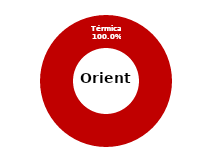
| Category | Oriente |
|---|---|
| Eólica | 0 |
| Hidráulica | 0 |
| Solar | 0 |
| Térmica | 33.632 |